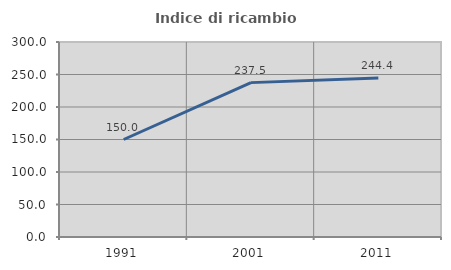
| Category | Indice di ricambio occupazionale  |
|---|---|
| 1991.0 | 150 |
| 2001.0 | 237.5 |
| 2011.0 | 244.444 |